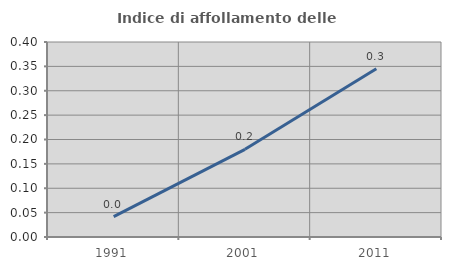
| Category | Indice di affollamento delle abitazioni  |
|---|---|
| 1991.0 | 0.042 |
| 2001.0 | 0.18 |
| 2011.0 | 0.345 |